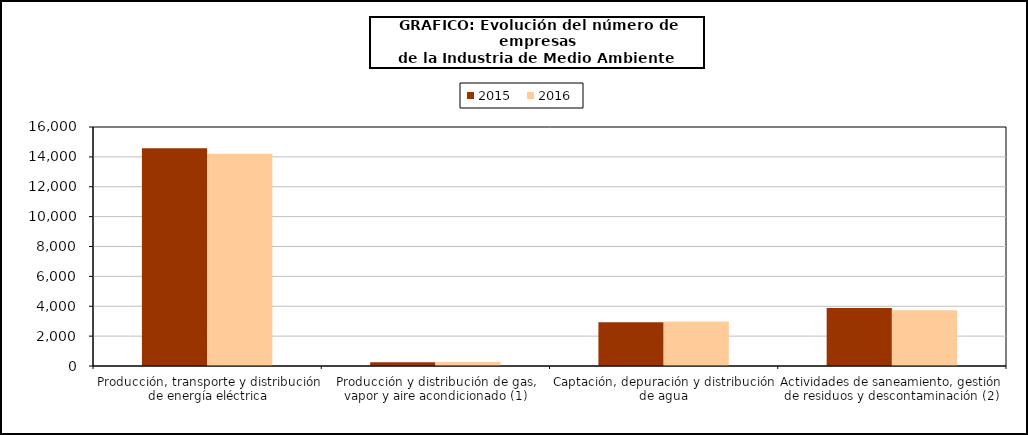
| Category | 2015 | 2016 |
|---|---|---|
| Producción, transporte y distribución de energía eléctrica | 14571 | 14211 |
| Producción y distribución de gas, vapor y aire acondicionado (1) | 255 | 264 |
| Captación, depuración y distribución de agua | 2924 | 2978 |
| Actividades de saneamiento, gestión de residuos y descontaminación (2) | 3878 | 3732 |